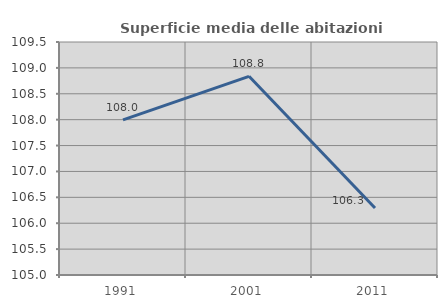
| Category | Superficie media delle abitazioni occupate |
|---|---|
| 1991.0 | 107.997 |
| 2001.0 | 108.837 |
| 2011.0 | 106.293 |